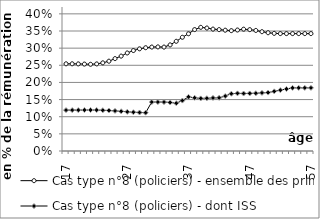
| Category | Cas type n°8 (policiers) - ensemble des primes | Cas type n°8 (policiers) - dont ISS |
|---|---|---|
| 17.0 | 0.254 | 0.119 |
| 18.0 | 0.254 | 0.119 |
| 19.0 | 0.254 | 0.119 |
| 20.0 | 0.254 | 0.119 |
| 21.0 | 0.253 | 0.12 |
| 22.0 | 0.254 | 0.119 |
| 23.0 | 0.257 | 0.119 |
| 24.0 | 0.262 | 0.118 |
| 25.0 | 0.269 | 0.117 |
| 26.0 | 0.277 | 0.116 |
| 27.0 | 0.286 | 0.114 |
| 28.0 | 0.293 | 0.113 |
| 29.0 | 0.298 | 0.112 |
| 30.0 | 0.301 | 0.112 |
| 31.0 | 0.303 | 0.143 |
| 32.0 | 0.304 | 0.143 |
| 33.0 | 0.303 | 0.143 |
| 34.0 | 0.309 | 0.142 |
| 35.0 | 0.32 | 0.139 |
| 36.0 | 0.332 | 0.147 |
| 37.0 | 0.342 | 0.158 |
| 38.0 | 0.354 | 0.155 |
| 39.0 | 0.361 | 0.153 |
| 40.0 | 0.359 | 0.154 |
| 41.0 | 0.356 | 0.155 |
| 42.0 | 0.354 | 0.155 |
| 43.0 | 0.352 | 0.16 |
| 44.0 | 0.351 | 0.167 |
| 45.0 | 0.353 | 0.168 |
| 46.0 | 0.355 | 0.168 |
| 47.0 | 0.354 | 0.168 |
| 48.0 | 0.352 | 0.169 |
| 49.0 | 0.348 | 0.17 |
| 50.0 | 0.345 | 0.17 |
| 51.0 | 0.343 | 0.174 |
| 52.0 | 0.342 | 0.178 |
| 53.0 | 0.342 | 0.181 |
| 54.0 | 0.342 | 0.184 |
| 55.0 | 0.342 | 0.184 |
| 56.0 | 0.342 | 0.184 |
| 57.0 | 0.342 | 0.184 |